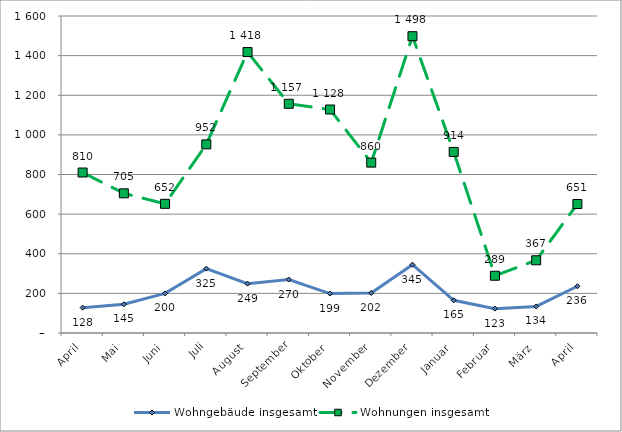
| Category | Wohngebäude insgesamt | Wohnungen insgesamt |
|---|---|---|
| April | 128 | 810 |
| Mai | 145 | 705 |
| Juni | 200 | 652 |
| Juli | 325 | 952 |
| August | 249 | 1418 |
| September | 270 | 1157 |
| Oktober | 199 | 1128 |
| November | 202 | 860 |
| Dezember | 345 | 1498 |
| Januar | 165 | 914 |
| Februar | 123 | 289 |
| März | 134 | 367 |
| April | 236 | 651 |